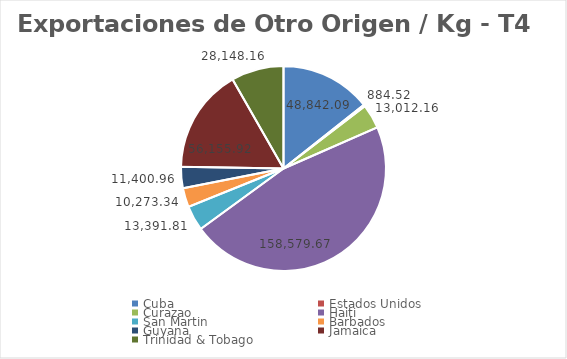
| Category | kg |
|---|---|
| Cuba | 48842.09 |
| Estados Unidos | 884.52 |
| Curazao | 13012.16 |
| Haiti | 158579.67 |
| San Martin | 13391.81 |
| Barbados | 10273.34 |
| Guyana | 11400.96 |
| Jamaica | 56155.92 |
| Trinidad & Tobago | 28148.16 |